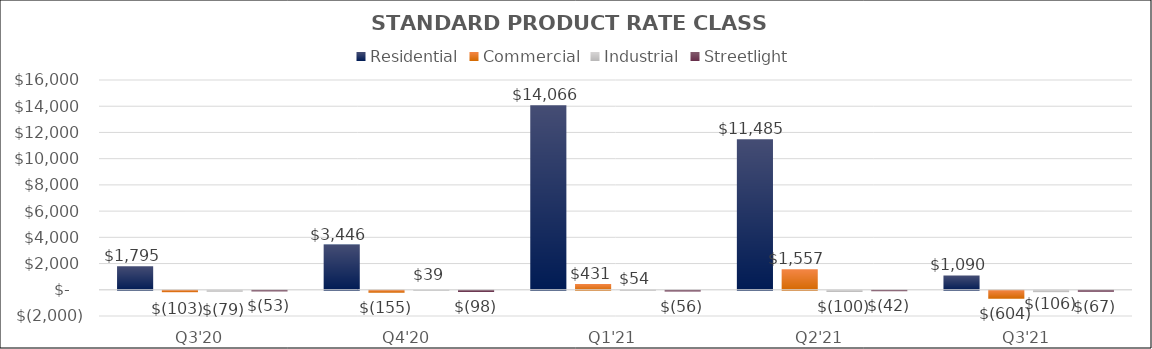
| Category | Residential | Commercial | Industrial | Streetlight |
|---|---|---|---|---|
| Q3'20 | 1794.94 | -103.425 | -79 | -53 |
| Q4'20 | 3446.134 | -154.962 | 39 | -98 |
| Q1'21 | 14066.133 | 431.439 | 54.07 | -55.991 |
| Q2'21 | 11485.074 | 1556.569 | -99.781 | -41.653 |
| Q3'21 | 1089.763 | -604.482 | -105.976 | -66.77 |